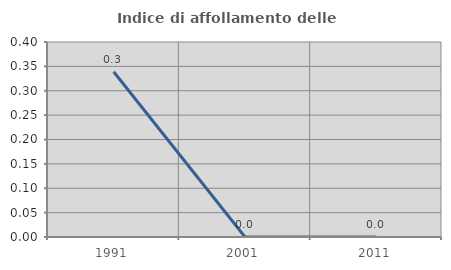
| Category | Indice di affollamento delle abitazioni  |
|---|---|
| 1991.0 | 0.339 |
| 2001.0 | 0 |
| 2011.0 | 0 |